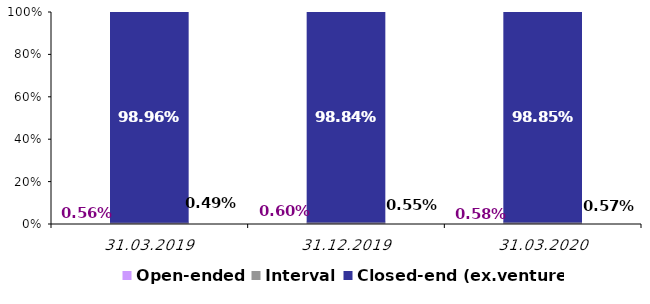
| Category | Open-ended | Interval | Closed-end (ex.venture) |
|---|---|---|---|
| 2019-03-31 | 0.006 | 0.005 | 0.99 |
| 2019-12-31 | 0.006 | 0.006 | 0.988 |
| 2020-03-31 | 0.006 | 0.006 | 0.989 |